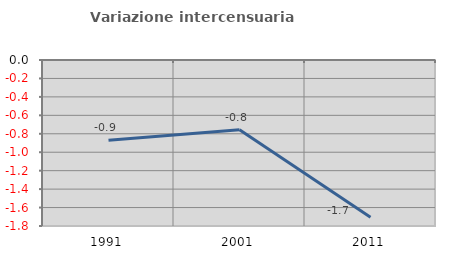
| Category | Variazione intercensuaria annua |
|---|---|
| 1991.0 | -0.871 |
| 2001.0 | -0.757 |
| 2011.0 | -1.704 |